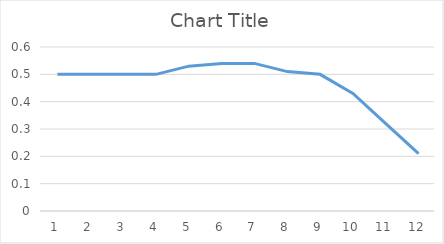
| Category | Series 0 |
|---|---|
| 0 | 0.5 |
| 1 | 0.5 |
| 2 | 0.5 |
| 3 | 0.5 |
| 4 | 0.53 |
| 5 | 0.54 |
| 6 | 0.54 |
| 7 | 0.51 |
| 8 | 0.5 |
| 9 | 0.43 |
| 10 | 0.32 |
| 11 | 0.21 |